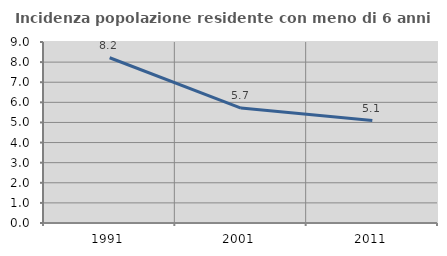
| Category | Incidenza popolazione residente con meno di 6 anni |
|---|---|
| 1991.0 | 8.218 |
| 2001.0 | 5.714 |
| 2011.0 | 5.092 |